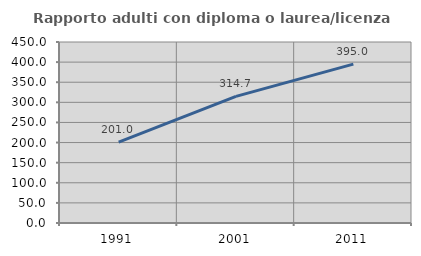
| Category | Rapporto adulti con diploma o laurea/licenza media  |
|---|---|
| 1991.0 | 201.02 |
| 2001.0 | 314.719 |
| 2011.0 | 394.955 |